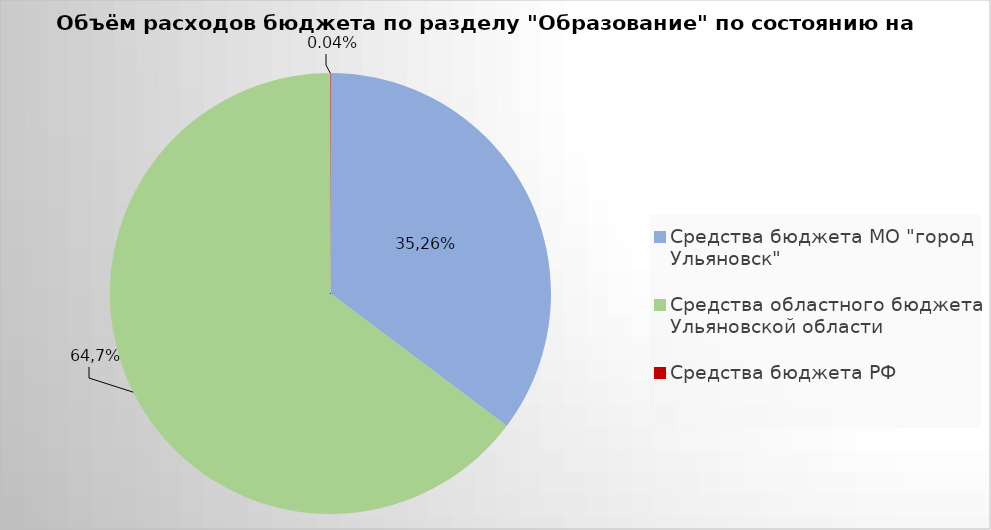
| Category | Series 0 |
|---|---|
| Средства бюджета МО "город Ульяновск" | 1682471.4 |
| Средства областного бюджета Ульяновской области | 3086989.52 |
| Средства бюджета РФ | 1755.475 |